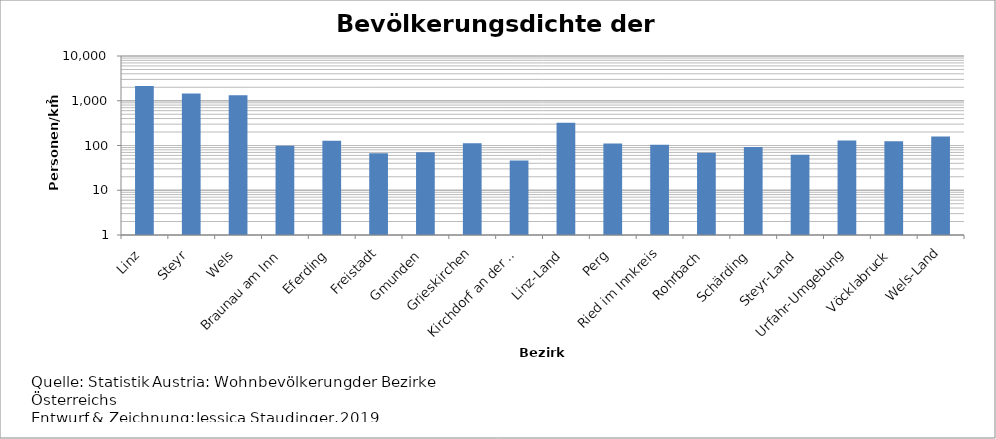
| Category | Series 0 |
|---|---|
| Linz | 2134 |
| Steyr | 1443 |
| Wels | 1333 |
| Braunau am Inn | 99 |
| Eferding | 127 |
| Freistadt | 67 |
| Gmunden | 71 |
| Grieskirchen | 112 |
| Kirchdorf an der Krems | 46 |
| Linz-Land | 323 |
| Perg | 111 |
| Ried im Innkreis | 104 |
| Rohrbach | 69 |
| Schärding | 93 |
| Steyr-Land | 62 |
| Urfahr-Umgebung | 129 |
| Vöcklabruck | 125 |
| Wels-Land | 158 |